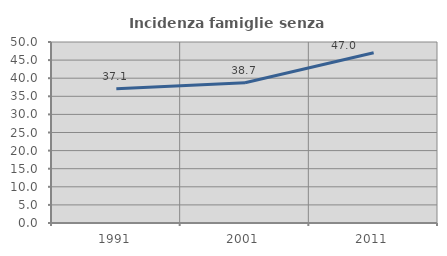
| Category | Incidenza famiglie senza nuclei |
|---|---|
| 1991.0 | 37.097 |
| 2001.0 | 38.728 |
| 2011.0 | 47.015 |